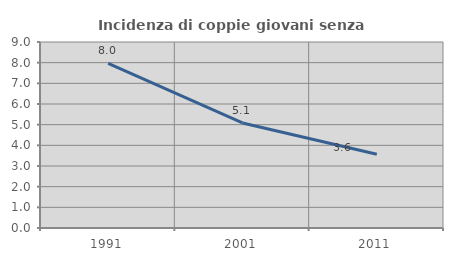
| Category | Incidenza di coppie giovani senza figli |
|---|---|
| 1991.0 | 7.965 |
| 2001.0 | 5.085 |
| 2011.0 | 3.571 |